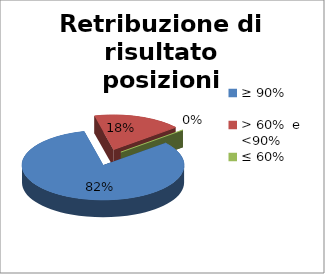
| Category | Retribuzione di risultato posizioni organizzative |
|---|---|
| ≥ 90% | 0.824 |
| > 60%  e  <90% | 0.176 |
| ≤ 60% | 0 |